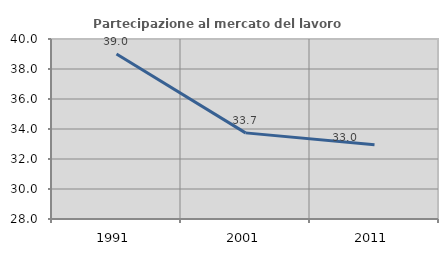
| Category | Partecipazione al mercato del lavoro  femminile |
|---|---|
| 1991.0 | 38.995 |
| 2001.0 | 33.742 |
| 2011.0 | 32.953 |